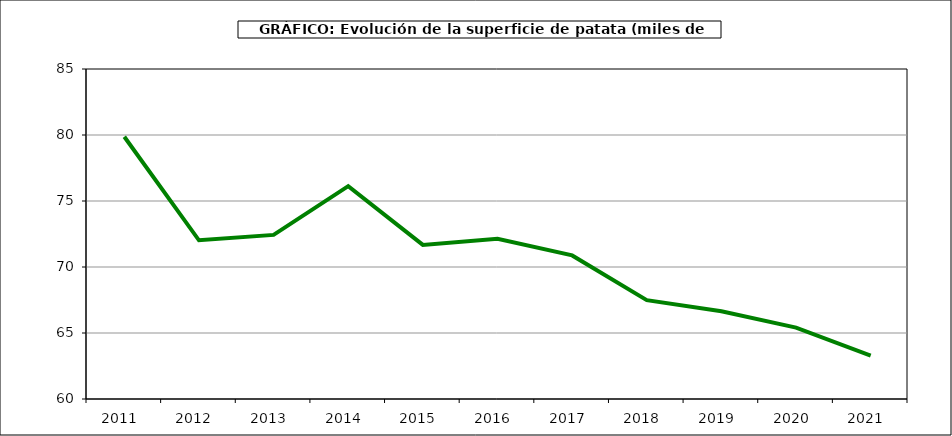
| Category | Superficie |
|---|---|
| 2011.0 | 79.865 |
| 2012.0 | 72.023 |
| 2013.0 | 72.431 |
| 2014.0 | 76.129 |
| 2015.0 | 71.676 |
| 2016.0 | 72.136 |
| 2017.0 | 70.878 |
| 2018.0 | 67.488 |
| 2019.0 | 66.65 |
| 2020.0 | 65.404 |
| 2021.0 | 63.283 |